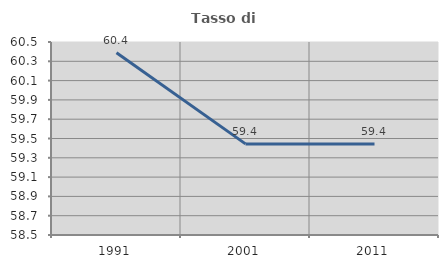
| Category | Tasso di occupazione   |
|---|---|
| 1991.0 | 60.388 |
| 2001.0 | 59.444 |
| 2011.0 | 59.443 |